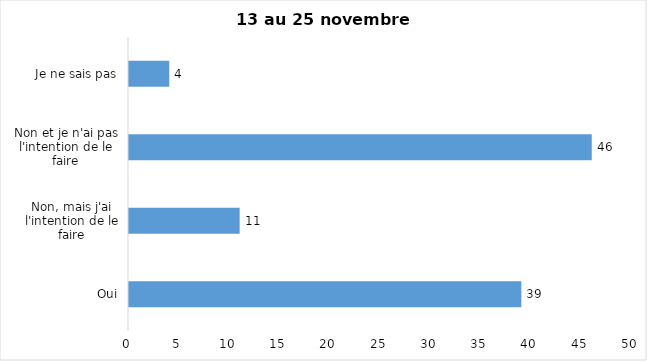
| Category | Series 0 |
|---|---|
| Oui | 39 |
| Non, mais j'ai l'intention de le faire | 11 |
| Non et je n'ai pas l'intention de le faire | 46 |
| Je ne sais pas | 4 |